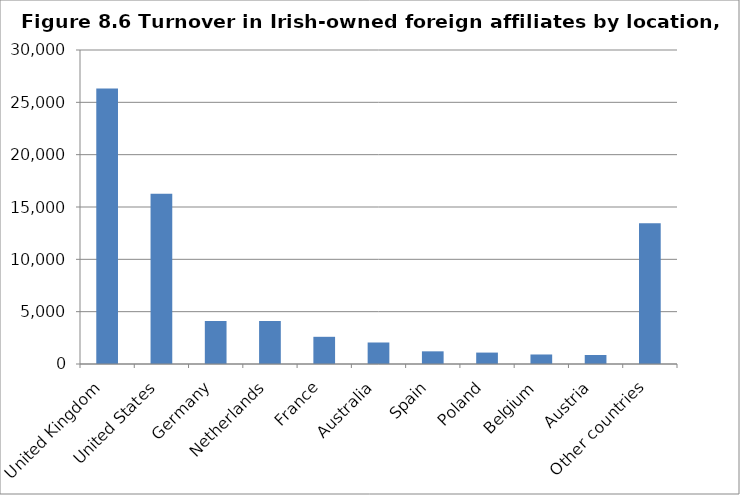
| Category | Series 0 |
|---|---|
| United Kingdom | 26310 |
| United States | 16270 |
| Germany | 4111 |
| Netherlands | 4098 |
| France | 2598 |
| Australia | 2055 |
| Spain | 1210 |
| Poland | 1091 |
| Belgium | 909 |
| Austria | 860 |
| Other countries | 13440 |